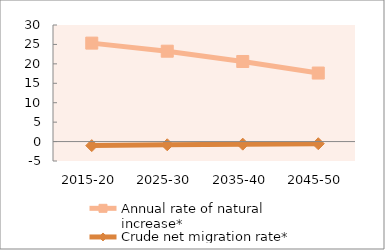
| Category | Annual rate of natural increase* | Crude net migration rate* |
|---|---|---|
| 2015-20 | 25.338 | -1.043 |
| 2025-30 | 23.258 | -0.826 |
| 2035-40 | 20.607 | -0.668 |
| 2045-50 | 17.635 | -0.555 |